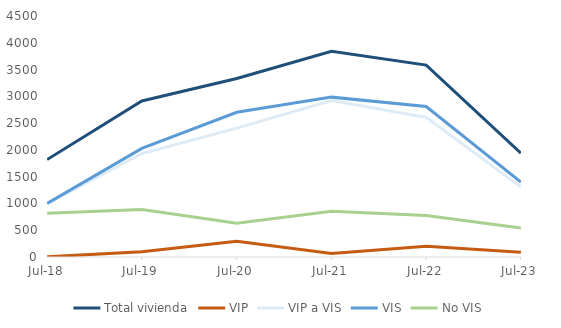
| Category | Total vivienda | VIP | VIP a VIS | VIS | No VIS |
|---|---|---|---|---|---|
| 2018-07-01 | 1819 | 4 | 996 | 1000 | 819 |
| 2019-07-01 | 2913 | 96 | 1932 | 2028 | 885 |
| 2020-07-01 | 3332 | 296 | 2407 | 2703 | 629 |
| 2021-07-01 | 3841 | 65 | 2920 | 2985 | 856 |
| 2022-07-01 | 3584 | 202 | 2608 | 2810 | 774 |
| 2023-07-01 | 1939 | 88 | 1309 | 1397 | 542 |